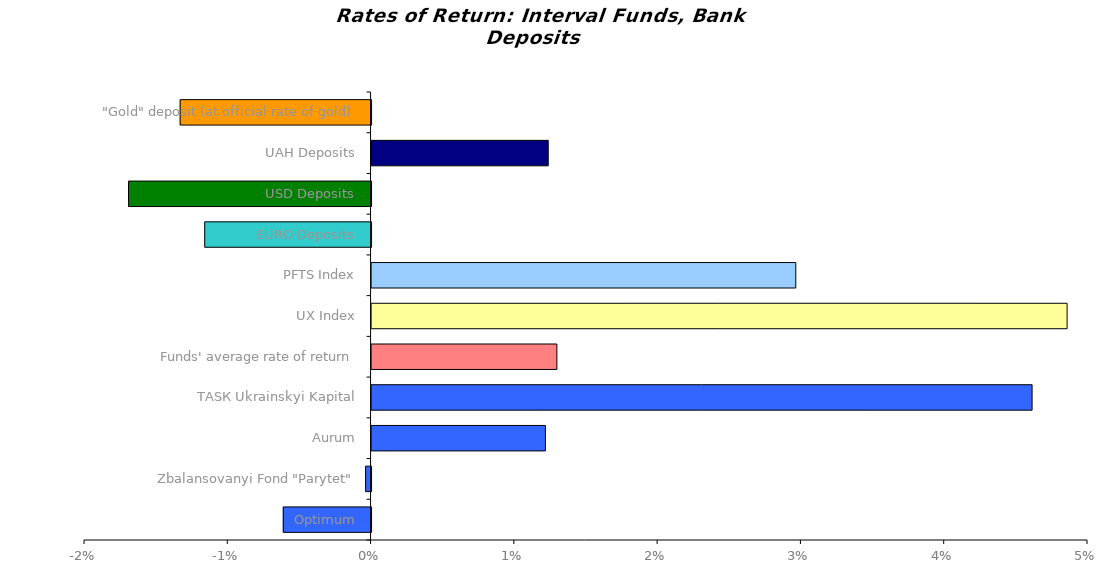
| Category | Series 0 |
|---|---|
| Optimum | -0.006 |
| Zbalansovanyi Fond "Parytet" | 0 |
| Аurum | 0.012 |
| ТАSК Ukrainskyi Kapital | 0.046 |
| Funds' average rate of return | 0.013 |
| UX Index | 0.049 |
| PFTS Index | 0.03 |
| EURO Deposits | -0.012 |
| USD Deposits | -0.017 |
| UAH Deposits | 0.012 |
| "Gold" deposit (at official rate of gold) | -0.013 |